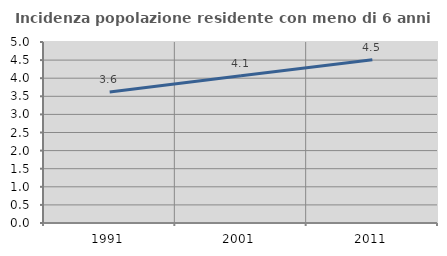
| Category | Incidenza popolazione residente con meno di 6 anni |
|---|---|
| 1991.0 | 3.617 |
| 2001.0 | 4.067 |
| 2011.0 | 4.511 |